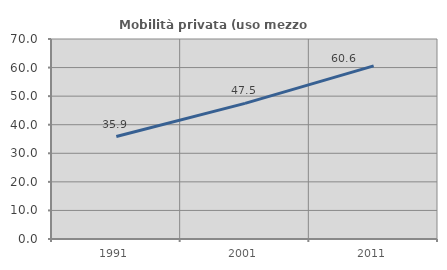
| Category | Mobilità privata (uso mezzo privato) |
|---|---|
| 1991.0 | 35.862 |
| 2001.0 | 47.472 |
| 2011.0 | 60.577 |